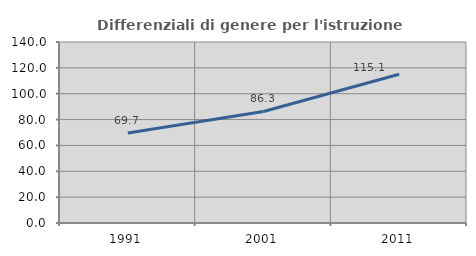
| Category | Differenziali di genere per l'istruzione superiore |
|---|---|
| 1991.0 | 69.674 |
| 2001.0 | 86.25 |
| 2011.0 | 115.052 |